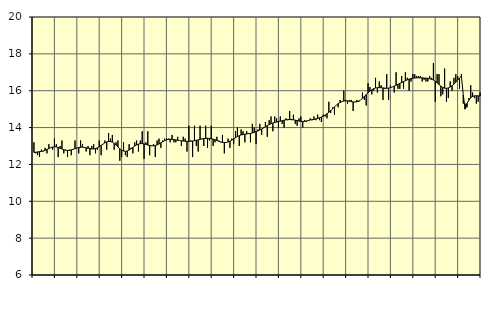
| Category | Utbildning, SNI 85 | Series 1 |
|---|---|---|
| nan | 13.2 | 12.65 |
| 1.0 | 12.6 | 12.66 |
| 1.0 | 12.5 | 12.68 |
| 1.0 | 12.4 | 12.69 |
| 1.0 | 12.8 | 12.71 |
| 1.0 | 12.7 | 12.73 |
| 1.0 | 12.9 | 12.77 |
| 1.0 | 12.6 | 12.81 |
| 1.0 | 13.1 | 12.86 |
| 1.0 | 12.9 | 12.91 |
| 1.0 | 12.8 | 12.94 |
| 1.0 | 13.4 | 12.96 |
| nan | 13.1 | 12.95 |
| 2.0 | 12.4 | 12.92 |
| 2.0 | 13 | 12.88 |
| 2.0 | 13.3 | 12.84 |
| 2.0 | 12.6 | 12.8 |
| 2.0 | 12.8 | 12.77 |
| 2.0 | 12.4 | 12.76 |
| 2.0 | 12.8 | 12.76 |
| 2.0 | 12.5 | 12.79 |
| 2.0 | 12.8 | 12.82 |
| 2.0 | 13.3 | 12.86 |
| 2.0 | 12.9 | 12.89 |
| nan | 12.6 | 12.92 |
| 3.0 | 13.3 | 12.93 |
| 3.0 | 13.1 | 12.94 |
| 3.0 | 12.9 | 12.92 |
| 3.0 | 12.7 | 12.9 |
| 3.0 | 13 | 12.88 |
| 3.0 | 12.5 | 12.86 |
| 3.0 | 13 | 12.84 |
| 3.0 | 13.1 | 12.84 |
| 3.0 | 12.6 | 12.86 |
| 3.0 | 12.8 | 12.9 |
| 3.0 | 13.3 | 12.96 |
| nan | 12.5 | 13.03 |
| 4.0 | 13.1 | 13.1 |
| 4.0 | 13.3 | 13.17 |
| 4.0 | 12.8 | 13.22 |
| 4.0 | 13.7 | 13.25 |
| 4.0 | 13.4 | 13.24 |
| 4.0 | 13.6 | 13.21 |
| 4.0 | 12.8 | 13.14 |
| 4.0 | 13.2 | 13.05 |
| 4.0 | 13.3 | 12.95 |
| 4.0 | 12.2 | 12.85 |
| 4.0 | 12.4 | 12.77 |
| nan | 13.2 | 12.73 |
| 5.0 | 12.5 | 12.71 |
| 5.0 | 12.4 | 12.73 |
| 5.0 | 13.1 | 12.78 |
| 5.0 | 12.9 | 12.85 |
| 5.0 | 12.6 | 12.92 |
| 5.0 | 13.2 | 13 |
| 5.0 | 13.3 | 13.06 |
| 5.0 | 12.7 | 13.1 |
| 5.0 | 13.3 | 13.13 |
| 5.0 | 13.8 | 13.13 |
| 5.0 | 12.3 | 13.11 |
| nan | 13.2 | 13.09 |
| 6.0 | 13.8 | 13.05 |
| 6.0 | 12.5 | 13.03 |
| 6.0 | 13 | 13.01 |
| 6.0 | 13.1 | 13.01 |
| 6.0 | 12.4 | 13.03 |
| 6.0 | 13.3 | 13.06 |
| 6.0 | 13.4 | 13.11 |
| 6.0 | 12.9 | 13.17 |
| 6.0 | 13.3 | 13.23 |
| 6.0 | 13.4 | 13.29 |
| 6.0 | 13.4 | 13.33 |
| nan | 13.4 | 13.36 |
| 7.0 | 13.2 | 13.37 |
| 7.0 | 13.6 | 13.36 |
| 7.0 | 13.2 | 13.35 |
| 7.0 | 13.2 | 13.33 |
| 7.0 | 13.5 | 13.31 |
| 7.0 | 13.3 | 13.3 |
| 7.0 | 13 | 13.28 |
| 7.0 | 13.5 | 13.27 |
| 7.0 | 13.4 | 13.26 |
| 7.0 | 12.7 | 13.25 |
| 7.0 | 14.1 | 13.25 |
| nan | 13.3 | 13.26 |
| 8.0 | 12.4 | 13.27 |
| 8.0 | 14.1 | 13.29 |
| 8.0 | 13 | 13.31 |
| 8.0 | 12.7 | 13.33 |
| 8.0 | 14.1 | 13.36 |
| 8.0 | 13.4 | 13.38 |
| 8.0 | 13 | 13.4 |
| 8.0 | 14.1 | 13.41 |
| 8.0 | 12.9 | 13.42 |
| 8.0 | 13.3 | 13.41 |
| 8.0 | 14.1 | 13.4 |
| nan | 13 | 13.37 |
| 9.0 | 13.2 | 13.34 |
| 9.0 | 13.5 | 13.3 |
| 9.0 | 13.3 | 13.26 |
| 9.0 | 13.2 | 13.22 |
| 9.0 | 13.6 | 13.2 |
| 9.0 | 12.6 | 13.19 |
| 9.0 | 13.2 | 13.19 |
| 9.0 | 13.4 | 13.22 |
| 9.0 | 12.9 | 13.26 |
| 9.0 | 13.4 | 13.32 |
| 9.0 | 13.1 | 13.39 |
| nan | 13.8 | 13.45 |
| 10.0 | 14 | 13.51 |
| 10.0 | 13 | 13.56 |
| 10.0 | 13.9 | 13.6 |
| 10.0 | 13.8 | 13.62 |
| 10.0 | 13.2 | 13.64 |
| 10.0 | 13.8 | 13.65 |
| 10.0 | 13.7 | 13.67 |
| 10.0 | 13.2 | 13.68 |
| 10.0 | 14.2 | 13.71 |
| 10.0 | 14 | 13.74 |
| 10.0 | 13.1 | 13.78 |
| nan | 13.9 | 13.82 |
| 11.0 | 14.2 | 13.87 |
| 11.0 | 13.6 | 13.92 |
| 11.0 | 14 | 13.98 |
| 11.0 | 14.3 | 14.05 |
| 11.0 | 13.5 | 14.11 |
| 11.0 | 14.4 | 14.16 |
| 11.0 | 14.6 | 14.21 |
| 11.0 | 13.8 | 14.25 |
| 11.0 | 14.6 | 14.28 |
| 11.0 | 14.5 | 14.3 |
| 11.0 | 14 | 14.33 |
| nan | 14.6 | 14.35 |
| 12.0 | 14.2 | 14.37 |
| 12.0 | 14 | 14.4 |
| 12.0 | 14.5 | 14.42 |
| 12.0 | 14.4 | 14.43 |
| 12.0 | 14.9 | 14.44 |
| 12.0 | 14.4 | 14.44 |
| 12.0 | 14.7 | 14.42 |
| 12.0 | 14.2 | 14.4 |
| 12.0 | 14.1 | 14.38 |
| 12.0 | 14.5 | 14.35 |
| 12.0 | 14.6 | 14.34 |
| nan | 14 | 14.33 |
| 13.0 | 14.4 | 14.34 |
| 13.0 | 14.3 | 14.36 |
| 13.0 | 14.4 | 14.38 |
| 13.0 | 14.5 | 14.41 |
| 13.0 | 14.4 | 14.43 |
| 13.0 | 14.6 | 14.44 |
| 13.0 | 14.4 | 14.47 |
| 13.0 | 14.7 | 14.49 |
| 13.0 | 14.4 | 14.53 |
| 13.0 | 14.3 | 14.57 |
| 13.0 | 14.7 | 14.62 |
| nan | 14.6 | 14.68 |
| 14.0 | 14.5 | 14.75 |
| 14.0 | 15.4 | 14.83 |
| 14.0 | 14.8 | 14.92 |
| 14.0 | 15.1 | 15.02 |
| 14.0 | 14.7 | 15.12 |
| 14.0 | 15.2 | 15.21 |
| 14.0 | 15.1 | 15.3 |
| 14.0 | 15.5 | 15.36 |
| 14.0 | 15.4 | 15.41 |
| 14.0 | 16 | 15.44 |
| 14.0 | 15.5 | 15.45 |
| nan | 15.3 | 15.45 |
| 15.0 | 15.5 | 15.43 |
| 15.0 | 15.5 | 15.41 |
| 15.0 | 14.9 | 15.39 |
| 15.0 | 15.4 | 15.39 |
| 15.0 | 15.5 | 15.4 |
| 15.0 | 15.4 | 15.44 |
| 15.0 | 15.5 | 15.5 |
| 15.0 | 15.9 | 15.59 |
| 15.0 | 15.5 | 15.69 |
| 15.0 | 15.2 | 15.79 |
| 15.0 | 16.4 | 15.89 |
| nan | 16.2 | 15.98 |
| 16.0 | 15.8 | 16.05 |
| 16.0 | 16 | 16.11 |
| 16.0 | 16.7 | 16.15 |
| 16.0 | 15.9 | 16.16 |
| 16.0 | 16.5 | 16.17 |
| 16.0 | 16.3 | 16.16 |
| 16.0 | 15.5 | 16.15 |
| 16.0 | 16.1 | 16.14 |
| 16.0 | 16.9 | 16.13 |
| 16.0 | 15.5 | 16.14 |
| 16.0 | 16.3 | 16.17 |
| nan | 16.2 | 16.2 |
| 17.0 | 15.9 | 16.25 |
| 17.0 | 17 | 16.3 |
| 17.0 | 16.1 | 16.35 |
| 17.0 | 16.1 | 16.4 |
| 17.0 | 16.8 | 16.44 |
| 17.0 | 16.1 | 16.49 |
| 17.0 | 17 | 16.54 |
| 17.0 | 16.7 | 16.59 |
| 17.0 | 16 | 16.63 |
| 17.0 | 16.5 | 16.66 |
| 17.0 | 16.9 | 16.68 |
| nan | 16.9 | 16.69 |
| 18.0 | 16.8 | 16.7 |
| 18.0 | 16.8 | 16.7 |
| 18.0 | 16.8 | 16.7 |
| 18.0 | 16.5 | 16.7 |
| 18.0 | 16.6 | 16.69 |
| 18.0 | 16.5 | 16.68 |
| 18.0 | 16.5 | 16.67 |
| 18.0 | 16.8 | 16.65 |
| 18.0 | 16.7 | 16.62 |
| 18.0 | 17.5 | 16.58 |
| 18.0 | 15.4 | 16.51 |
| nan | 16.9 | 16.43 |
| 19.0 | 16.9 | 16.34 |
| 19.0 | 15.7 | 16.25 |
| 19.0 | 15.8 | 16.18 |
| 19.0 | 17.2 | 16.14 |
| 19.0 | 15.4 | 16.13 |
| 19.0 | 15.6 | 16.15 |
| 19.0 | 16.5 | 16.2 |
| 19.0 | 16 | 16.27 |
| 19.0 | 16.7 | 16.36 |
| 19.0 | 16.9 | 16.46 |
| 19.0 | 16.8 | 16.58 |
| nan | 16.1 | 16.69 |
| 20.0 | 16.9 | 16.8 |
| 20.0 | 15.3 | 15.77 |
| 20.0 | 15.3 | 15 |
| 20.0 | 15.1 | 15.3 |
| 20.0 | 15.6 | 15.49 |
| 20.0 | 16.3 | 15.62 |
| 20.0 | 15.9 | 15.69 |
| 20.0 | 15.6 | 15.72 |
| 20.0 | 15.3 | 15.73 |
| 20.0 | 15.4 | 15.72 |
| 20.0 | 15.9 | 15.71 |